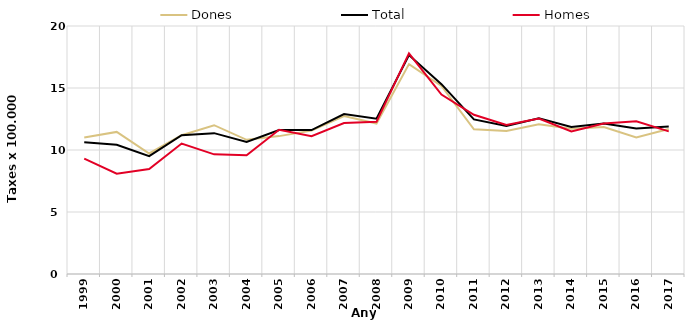
| Category | Dones | Total | Homes |
|---|---|---|---|
| 1999.0 | 11 | 10.63 | 9.31 |
| 2000.0 | 11.46 | 10.42 | 8.09 |
| 2001.0 | 9.72 | 9.5 | 8.46 |
| 2002.0 | 11.19 | 11.19 | 10.52 |
| 2003.0 | 12 | 11.36 | 9.65 |
| 2004.0 | 10.82 | 10.65 | 9.57 |
| 2005.0 | 11.12 | 11.61 | 11.63 |
| 2006.0 | 11.56 | 11.61 | 11.12 |
| 2007.0 | 12.73 | 12.9 | 12.18 |
| 2008.0 | 12.13 | 12.52 | 12.27 |
| 2009.0 | 16.93 | 17.66 | 17.79 |
| 2010.0 | 15.17 | 15.31 | 14.47 |
| 2011.0 | 11.67 | 12.47 | 12.84 |
| 2012.0 | 11.53 | 11.93 | 12.02 |
| 2013.0 | 12.07 | 12.56 | 12.53 |
| 2014.0 | 11.71 | 11.85 | 11.49 |
| 2015.0 | 11.86 | 12.13 | 12.13 |
| 2016.0 | 11.02 | 11.74 | 12.31 |
| 2017.0 | 11.7 | 11.9 | 11.5 |